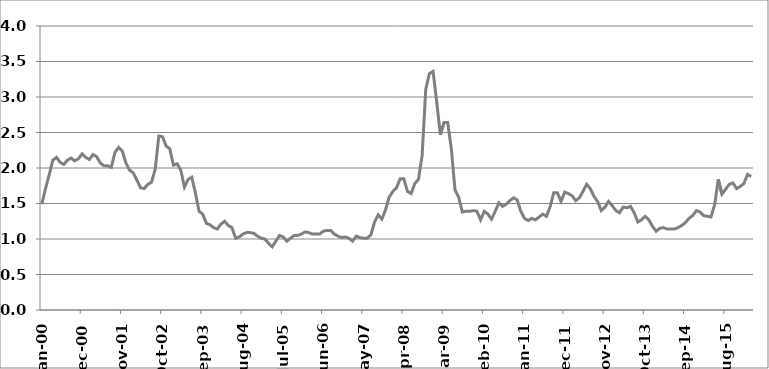
| Category | Series 1 |
|---|---|
| 2000-01-01 | 1.49 |
| 2000-02-01 | 1.71 |
| 2000-03-01 | 1.9 |
| 2000-04-01 | 2.11 |
| 2000-05-01 | 2.15 |
| 2000-06-01 | 2.08 |
| 2000-07-01 | 2.05 |
| 2000-08-01 | 2.11 |
| 2000-09-01 | 2.14 |
| 2000-10-01 | 2.1 |
| 2000-11-01 | 2.13 |
| 2000-12-01 | 2.2 |
| 2001-01-01 | 2.15 |
| 2001-02-01 | 2.12 |
| 2001-03-01 | 2.19 |
| 2001-04-01 | 2.16 |
| 2001-05-01 | 2.07 |
| 2001-06-01 | 2.03 |
| 2001-07-01 | 2.03 |
| 2001-08-01 | 2.01 |
| 2001-09-01 | 2.22 |
| 2001-10-01 | 2.29 |
| 2001-11-01 | 2.24 |
| 2001-12-01 | 2.07 |
| 2002-01-01 | 1.97 |
| 2002-02-01 | 1.93 |
| 2002-03-01 | 1.83 |
| 2002-04-01 | 1.72 |
| 2002-05-01 | 1.71 |
| 2002-06-01 | 1.77 |
| 2002-07-01 | 1.8 |
| 2002-08-01 | 1.98 |
| 2002-09-01 | 2.45 |
| 2002-10-01 | 2.44 |
| 2002-11-01 | 2.31 |
| 2002-12-01 | 2.27 |
| 2003-01-01 | 2.04 |
| 2003-02-01 | 2.06 |
| 2003-03-01 | 1.97 |
| 2003-04-01 | 1.73 |
| 2003-05-01 | 1.84 |
| 2003-06-01 | 1.87 |
| 2003-07-01 | 1.65 |
| 2003-08-01 | 1.39 |
| 2003-09-01 | 1.35 |
| 2003-10-01 | 1.22 |
| 2003-11-01 | 1.2 |
| 2003-12-01 | 1.16 |
| 2004-01-01 | 1.14 |
| 2004-02-01 | 1.21 |
| 2004-03-01 | 1.25 |
| 2004-04-01 | 1.19 |
| 2004-05-01 | 1.16 |
| 2004-06-01 | 1.01 |
| 2004-07-01 | 1.03 |
| 2004-08-01 | 1.07 |
| 2004-09-01 | 1.09 |
| 2004-10-01 | 1.09 |
| 2004-11-01 | 1.08 |
| 2004-12-01 | 1.04 |
| 2005-01-01 | 1.01 |
| 2005-02-01 | 1 |
| 2005-03-01 | 0.94 |
| 2005-04-01 | 0.89 |
| 2005-05-01 | 0.97 |
| 2005-06-01 | 1.05 |
| 2005-07-01 | 1.03 |
| 2005-08-01 | 0.97 |
| 2005-09-01 | 1.01 |
| 2005-10-01 | 1.05 |
| 2005-11-01 | 1.05 |
| 2005-12-01 | 1.07 |
| 2006-01-01 | 1.1 |
| 2006-02-01 | 1.09 |
| 2006-03-01 | 1.07 |
| 2006-04-01 | 1.07 |
| 2006-05-01 | 1.07 |
| 2006-06-01 | 1.11 |
| 2006-07-01 | 1.12 |
| 2006-08-01 | 1.12 |
| 2006-09-01 | 1.07 |
| 2006-10-01 | 1.04 |
| 2006-11-01 | 1.02 |
| 2006-12-01 | 1.03 |
| 2007-01-01 | 1.01 |
| 2007-02-01 | 0.97 |
| 2007-03-01 | 1.04 |
| 2007-04-01 | 1.02 |
| 2007-05-01 | 1.01 |
| 2007-06-01 | 1.01 |
| 2007-07-01 | 1.06 |
| 2007-08-01 | 1.24 |
| 2007-09-01 | 1.34 |
| 2007-10-01 | 1.28 |
| 2007-11-01 | 1.41 |
| 2007-12-01 | 1.59 |
| 2008-01-01 | 1.67 |
| 2008-02-01 | 1.72 |
| 2008-03-01 | 1.85 |
| 2008-04-01 | 1.85 |
| 2008-05-01 | 1.67 |
| 2008-06-01 | 1.64 |
| 2008-07-01 | 1.78 |
| 2008-08-01 | 1.84 |
| 2008-09-01 | 2.17 |
| 2008-10-01 | 3.11 |
| 2008-11-01 | 3.33 |
| 2008-12-01 | 3.36 |
| 2009-01-01 | 2.93 |
| 2009-02-01 | 2.47 |
| 2009-03-01 | 2.64 |
| 2009-04-01 | 2.64 |
| 2009-05-01 | 2.27 |
| 2009-06-01 | 1.69 |
| 2009-07-01 | 1.59 |
| 2009-08-01 | 1.38 |
| 2009-09-01 | 1.39 |
| 2009-10-01 | 1.39 |
| 2009-11-01 | 1.4 |
| 2009-12-01 | 1.39 |
| 2010-01-01 | 1.27 |
| 2010-02-01 | 1.39 |
| 2010-03-01 | 1.35 |
| 2010-04-01 | 1.28 |
| 2010-05-01 | 1.39 |
| 2010-06-01 | 1.51 |
| 2010-07-01 | 1.46 |
| 2010-08-01 | 1.49 |
| 2010-09-01 | 1.54 |
| 2010-10-01 | 1.58 |
| 2010-11-01 | 1.55 |
| 2010-12-01 | 1.39 |
| 2011-01-01 | 1.29 |
| 2011-02-01 | 1.26 |
| 2011-03-01 | 1.29 |
| 2011-04-01 | 1.27 |
| 2011-05-01 | 1.31 |
| 2011-06-01 | 1.35 |
| 2011-07-01 | 1.32 |
| 2011-08-01 | 1.45 |
| 2011-09-01 | 1.65 |
| 2011-10-01 | 1.65 |
| 2011-11-01 | 1.53 |
| 2011-12-01 | 1.66 |
| 2012-01-01 | 1.64 |
| 2012-02-01 | 1.61 |
| 2012-03-01 | 1.54 |
| 2012-04-01 | 1.58 |
| 2012-05-01 | 1.67 |
| 2012-06-01 | 1.77 |
| 2012-07-01 | 1.71 |
| 2012-08-01 | 1.6 |
| 2012-09-01 | 1.53 |
| 2012-10-01 | 1.4 |
| 2012-11-01 | 1.45 |
| 2012-12-01 | 1.53 |
| 2013-01-01 | 1.47 |
| 2013-02-01 | 1.4 |
| 2013-03-01 | 1.37 |
| 2013-04-01 | 1.45 |
| 2013-05-01 | 1.44 |
| 2013-06-01 | 1.46 |
| 2013-07-01 | 1.37 |
| 2013-08-01 | 1.24 |
| 2013-09-01 | 1.27 |
| 2013-10-01 | 1.32 |
| 2013-11-01 | 1.27 |
| 2013-12-01 | 1.18 |
| 2014-01-01 | 1.11 |
| 2014-02-01 | 1.15 |
| 2014-03-01 | 1.16 |
| 2014-04-01 | 1.14 |
| 2014-05-01 | 1.14 |
| 2014-06-01 | 1.14 |
| 2014-07-01 | 1.16 |
| 2014-08-01 | 1.19 |
| 2014-09-01 | 1.23 |
| 2014-10-01 | 1.29 |
| 2014-11-01 | 1.33 |
| 2014-12-01 | 1.4 |
| 2015-01-01 | 1.38 |
| 2015-02-01 | 1.33 |
| 2015-03-01 | 1.32 |
| 2015-04-01 | 1.31 |
| 2015-05-01 | 1.48 |
| 2015-06-01 | 1.84 |
| 2015-07-01 | 1.63 |
| 2015-08-01 | 1.7 |
| 2015-09-01 | 1.77 |
| 2015-10-01 | 1.79 |
| 2015-11-01 | 1.71 |
| 2015-12-01 | 1.74 |
| 2016-01-01 | 1.78 |
| 2016-02-01 | 1.91 |
| 2016-03-01 | 1.88 |